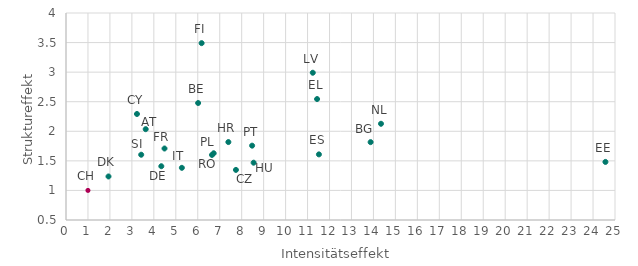
| Category | Struktureffekt |
|---|---|
| 3.6296191215515137 | 2.036 |
| 6.016900539398193 | 2.478 |
| 13.871429443359375 | 1.816 |
| 3.231226682662964 | 2.293 |
| 7.738376617431641 | 1.347 |
| 4.340560436248779 | 1.409 |
| 1.9350396394729614 | 1.236 |
| 24.564634323120117 | 1.482 |
| 11.43328857421875 | 2.545 |
| 11.517553329467773 | 1.609 |
| 6.176276206970215 | 3.49 |
| 4.485922813415527 | 1.709 |
| 7.393872261047363 | 1.818 |
| 8.543970108032227 | 1.469 |
| 5.276215553283691 | 1.382 |
| 11.238018035888672 | 2.99 |
| 14.344430923461914 | 2.127 |
| 6.725461959838867 | 1.628 |
| 8.475424766540527 | 1.757 |
| 6.648167133331299 | 1.6 |
| 3.4242866039276123 | 1.604 |
| 1.0 | 1 |